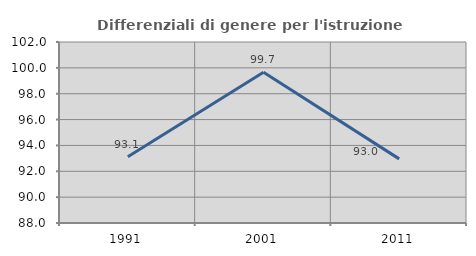
| Category | Differenziali di genere per l'istruzione superiore |
|---|---|
| 1991.0 | 93.122 |
| 2001.0 | 99.653 |
| 2011.0 | 92.96 |